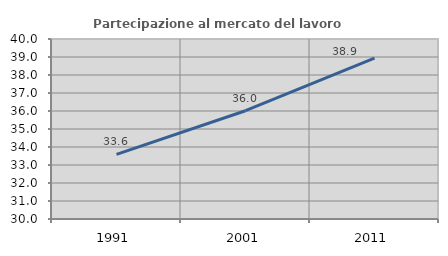
| Category | Partecipazione al mercato del lavoro  femminile |
|---|---|
| 1991.0 | 33.591 |
| 2001.0 | 36.015 |
| 2011.0 | 38.934 |